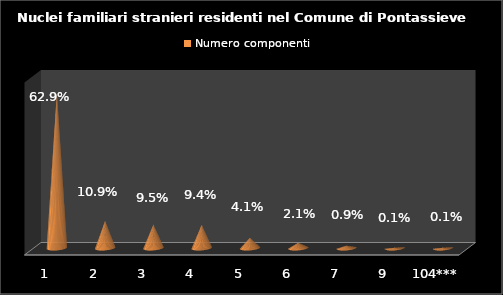
| Category | Numero componenti |
|---|---|
| 1  | 0.629 |
| 2  | 0.109 |
| 3  | 0.095 |
| 4  | 0.094 |
| 5  | 0.041 |
| 6  | 0.021 |
| 7  | 0.009 |
| 9  | 0.001 |
| 104*** | 0.001 |